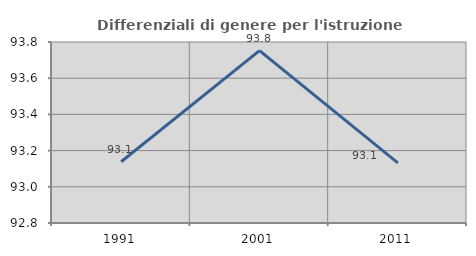
| Category | Differenziali di genere per l'istruzione superiore |
|---|---|
| 1991.0 | 93.138 |
| 2001.0 | 93.752 |
| 2011.0 | 93.132 |